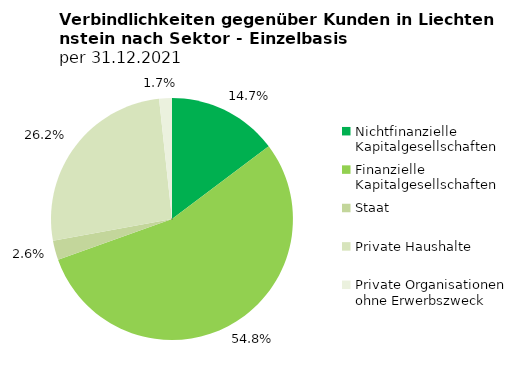
| Category | Series 0 |
|---|---|
| Nichtfinanzielle Kapitalgesellschaften | 2886547 |
| Finanzielle Kapitalgesellschaften | 10729683 |
| Staat | 505129 |
| Private Haushalte | 5124693 |
| Private Organisationen ohne Erwerbszweck | 334452 |